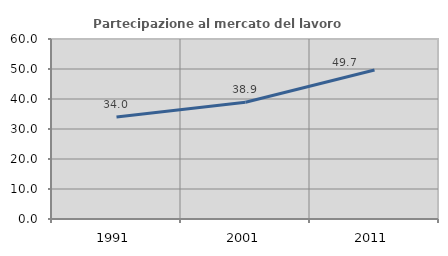
| Category | Partecipazione al mercato del lavoro  femminile |
|---|---|
| 1991.0 | 34 |
| 2001.0 | 38.937 |
| 2011.0 | 49.67 |